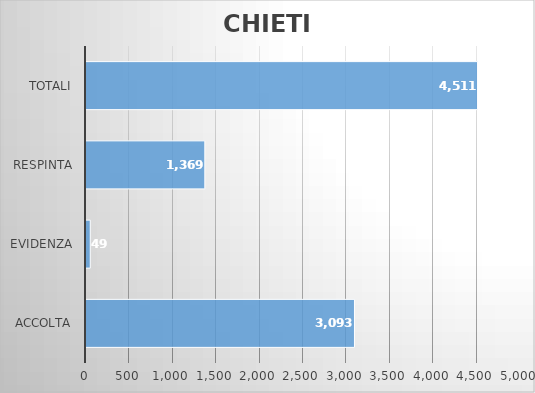
| Category | CHIETI |
|---|---|
| ACCOLTA | 3093 |
| EVIDENZA | 49 |
| RESPINTA | 1369 |
| Totali | 4511 |